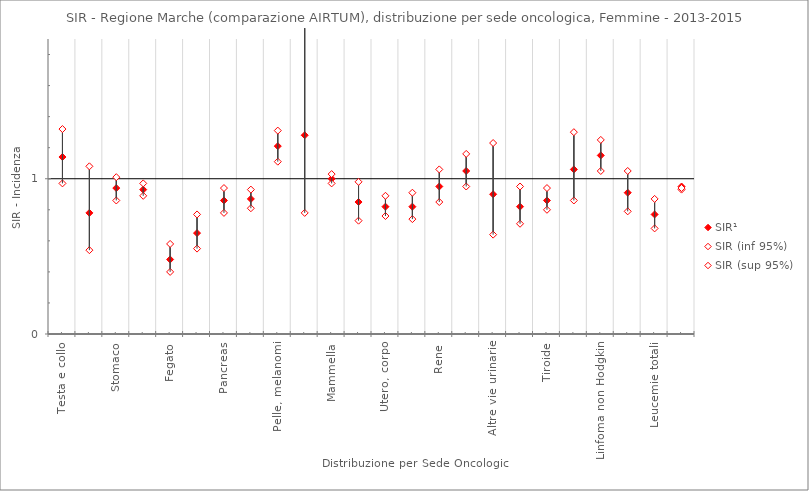
| Category | SIR¹ | SIR (inf 95%) | SIR (sup 95%) |
|---|---|---|---|
| Testa e collo | 1.14 | 0.97 | 1.32 |
| Esofago | 0.78 | 0.54 | 1.08 |
| Stomaco | 0.94 | 0.86 | 1.01 |
| Colon, retto e ano | 0.93 | 0.89 | 0.97 |
| Fegato | 0.48 | 0.4 | 0.58 |
| Vie biliari | 0.65 | 0.55 | 0.77 |
| Pancreas | 0.86 | 0.78 | 0.94 |
| Polmone | 0.87 | 0.81 | 0.93 |
| Pelle, melanomi | 1.21 | 1.11 | 1.31 |
| Mesotelioma | 1.28 | 0.78 | 1.97 |
| Mammella | 1 | 0.97 | 1.03 |
| Utero, collo | 0.85 | 0.73 | 0.98 |
| Utero, corpo | 0.82 | 0.76 | 0.89 |
| Ovaio | 0.82 | 0.74 | 0.91 |
| Rene | 0.95 | 0.85 | 1.06 |
| Vescica totale | 1.05 | 0.95 | 1.16 |
| Altre vie urinarie | 0.9 | 0.64 | 1.23 |
| Encefalo e altro SNC (maligni) | 0.82 | 0.71 | 0.95 |
| Tiroide | 0.86 | 0.8 | 0.94 |
| Linfoma di Hodgkin | 1.06 | 0.86 | 1.3 |
| Linfoma non Hodgkin | 1.15 | 1.05 | 1.25 |
| Mieloma | 0.91 | 0.79 | 1.05 |
| Leucemie totali | 0.77 | 0.68 | 0.87 |
| TOTALE ESCLUSO CUTE E SNC NON MALIGNO | 0.95 | 0.93 | 0.94 |